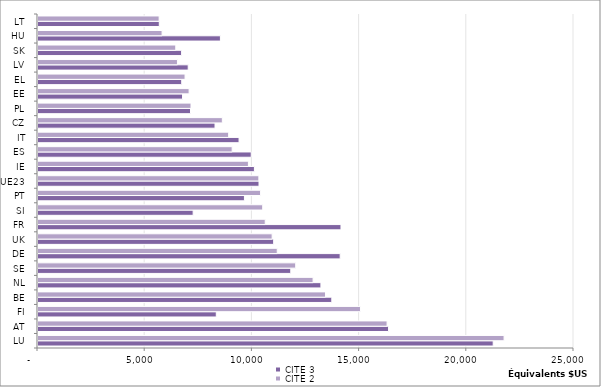
| Category | CITE 3 | CITE 2 |
|---|---|---|
| LU | 21231.088 | 21738.627 |
| AT | 16350.742 | 16282.216 |
| FI | 8315.414 | 15040.937 |
| BE | 13703.645 | 13408.934 |
| NL | 13195.608 | 12830.594 |
| SE | 11790.169 | 12020.346 |
| DE | 14094.101 | 11158.854 |
| UK | 10991.806 | 10920.955 |
| FR | 14131.665 | 10598.937 |
| SI | 7236.38 | 10480.577 |
| PT | 9628.003 | 10381.651 |
| UE23 | 10307.836 | 10301.582 |
| IE | 10094.136 | 9814.443 |
| ES | 9946.108 | 9056.448 |
| IT | 9377.358 | 8892.885 |
| CZ | 8256.739 | 8597.877 |
| PL | 7114.07 | 7136.217 |
| EE | 6742.462 | 7047.452 |
| EL | 6703.912 | 6858.597 |
| LV | 7005.765 | 6504.295 |
| SK | 6697.651 | 6425.637 |
| HU | 8508.121 | 5787.788 |
| LT | 5657.451 | 5650.546 |